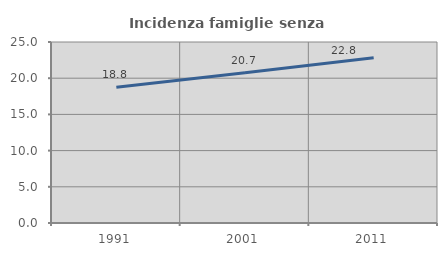
| Category | Incidenza famiglie senza nuclei |
|---|---|
| 1991.0 | 18.761 |
| 2001.0 | 20.737 |
| 2011.0 | 22.826 |